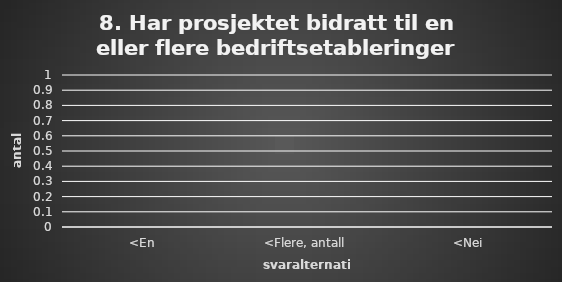
| Category | Series 0 |
|---|---|
| <En | 0 |
| <Flere, antall | 0 |
| <Nei | 0 |